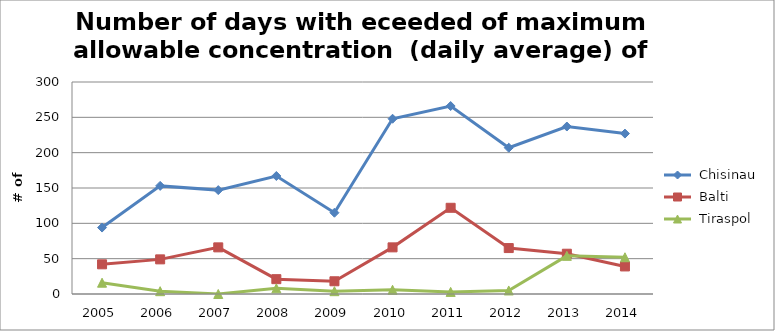
| Category |  Chisinau |  Balti  |  Tiraspol |
|---|---|---|---|
| 2005.0 | 94 | 42 | 16 |
| 2006.0 | 153 | 49 | 4 |
| 2007.0 | 147 | 66 | 0 |
| 2008.0 | 167 | 21 | 8 |
| 2009.0 | 115 | 18 | 4 |
| 2010.0 | 248 | 66 | 6 |
| 2011.0 | 266 | 122 | 3 |
| 2012.0 | 207 | 65 | 5 |
| 2013.0 | 237 | 57 | 54 |
| 2014.0 | 227 | 39 | 52 |